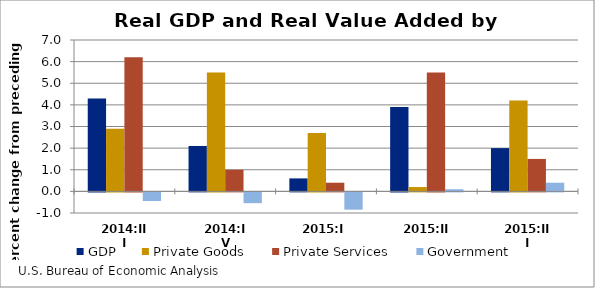
| Category | GDP | Private Goods | Private Services | Government |
|---|---|---|---|---|
| 2014:III | 4.3 | 2.9 | 6.2 | -0.4 |
| 2014:IV | 2.1 | 5.5 | 1 | -0.5 |
| 2015:I | 0.6 | 2.7 | 0.4 | -0.8 |
| 2015:II | 3.9 | 0.2 | 5.5 | 0.1 |
| 2015:III | 2 | 4.2 | 1.5 | 0.4 |